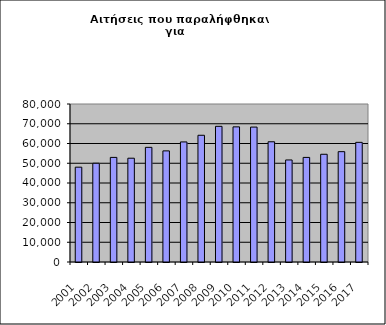
| Category | Series 1 |
|---|---|
| 2001.0 | 48010 |
| 2002.0 | 49998 |
| 2003.0 | 52964 |
| 2004.0 | 52551 |
| 2005.0 | 58046 |
| 2006.0 | 56263 |
| 2007.0 | 60792 |
| 2008.0 | 64163 |
| 2009.0 | 68694 |
| 2010.0 | 68418 |
| 2011.0 | 68310 |
| 2012.0 | 60877 |
| 2013.0 | 51662 |
| 2014.0 | 52955 |
| 2015.0 | 54542 |
| 2016.0 | 55868 |
| 2017.0 | 60582 |